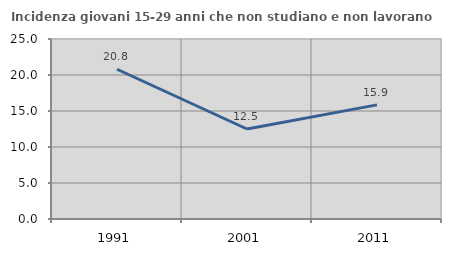
| Category | Incidenza giovani 15-29 anni che non studiano e non lavorano  |
|---|---|
| 1991.0 | 20.8 |
| 2001.0 | 12.5 |
| 2011.0 | 15.854 |